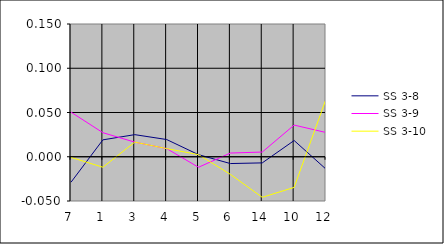
| Category | SS 3-8 | SS 3-9 | SS 3-10 |
|---|---|---|---|
| 7.0 | -0.029 | 0.05 | -0.001 |
| 1.0 | 0.019 | 0.027 | -0.012 |
| 3.0 | 0.025 | 0.017 | 0.017 |
| 4.0 | 0.019 | 0.009 | 0.009 |
| 5.0 | 0.002 | -0.012 | 0.002 |
| 6.0 | -0.008 | 0.004 | -0.02 |
| 14.0 | -0.007 | 0.005 | -0.046 |
| 10.0 | 0.018 | 0.036 | -0.035 |
| 12.0 | -0.014 | 0.027 | 0.065 |